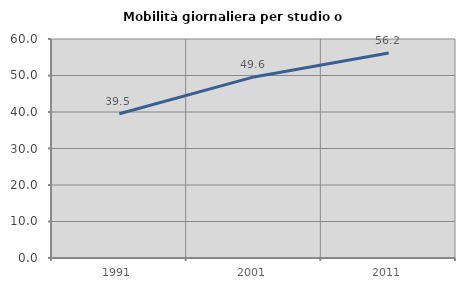
| Category | Mobilità giornaliera per studio o lavoro |
|---|---|
| 1991.0 | 39.535 |
| 2001.0 | 49.612 |
| 2011.0 | 56.158 |